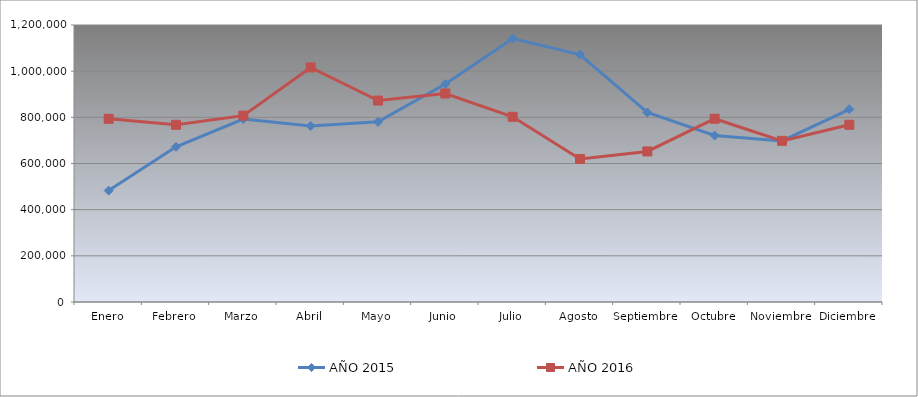
| Category | AÑO 2015 | AÑO 2016 |
|---|---|---|
| Enero | 482640 | 793560 |
| Febrero | 672350 | 767760 |
| Marzo | 792610 | 807290 |
| Abril | 762160 | 1016250 |
| Mayo | 780440 | 872640 |
| Junio | 944270 | 903340 |
| Julio | 1141510 | 802260 |
| Agosto | 1071680 | 619560 |
| Septiembre | 820990 | 652360 |
| Octubre | 721260 | 793920 |
| Noviembre | 697830 | 698160 |
| Diciembre | 834900 | 767810 |